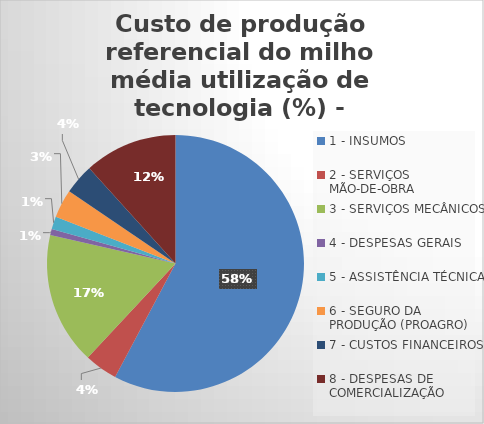
| Category | Series 0 |
|---|---|
| 1 - INSUMOS | 57.786 |
| 2 - SERVIÇOS MÃO-DE-OBRA | 4.162 |
| 3 - SERVIÇOS MECÂNICOS | 16.605 |
| 4 - DESPESAS GERAIS  | 0.786 |
| 5 - ASSISTÊNCIA TÉCNICA | 1.587 |
| 6 - SEGURO DA PRODUÇÃO (PROAGRO) | 3.57 |
| 7 - CUSTOS FINANCEIROS | 3.802 |
| 8 - DESPESAS DE COMERCIALIZAÇÃO | 11.703 |